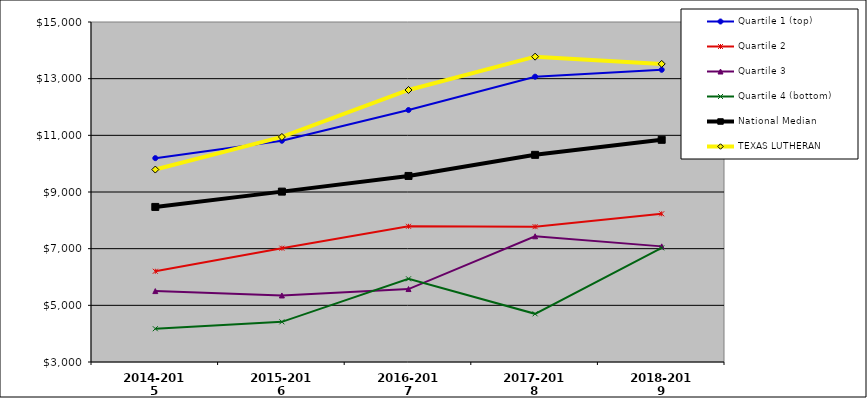
| Category | Quartile 1 (top) | Quartile 2 | Quartile 3 | Quartile 4 (bottom) | National Median | TEXAS LUTHERAN |
|---|---|---|---|---|---|---|
| 2014-2015 | 10194.863 | 6202.422 | 5502.683 | 4174.443 | 8473.314 | 9792.02 |
| 2015-2016 | 10808.891 | 7016.424 | 5348.644 | 4418.017 | 9013.486 | 10943.363 |
| 2016-2017 | 11892.406 | 7789.357 | 5574.571 | 5936.42 | 9566.64 | 12600.824 |
| 2017-2018 | 13069.805 | 7776.263 | 7436.877 | 4700.719 | 10311.147 | 13775.86 |
| 2018-2019 | 13313.747 | 8231.184 | 7080.899 | 7028.816 | 10842.044 | 13520.988 |